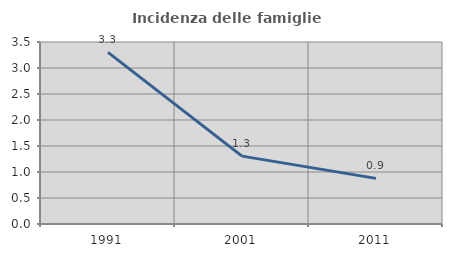
| Category | Incidenza delle famiglie numerose |
|---|---|
| 1991.0 | 3.3 |
| 2001.0 | 1.305 |
| 2011.0 | 0.877 |